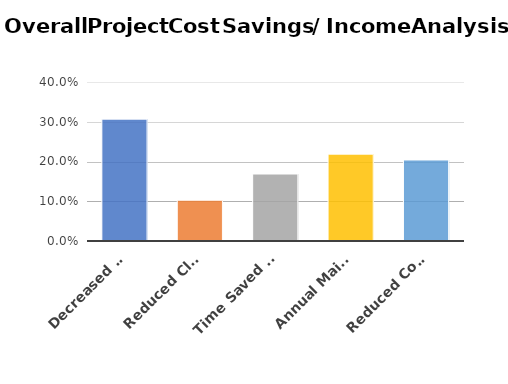
| Category | Series 0 |
|---|---|
| Decreased Helpdesk Support | 0.307 |
| Reduced Clerical Staff | 0.103 |
| Time Saved - manual creation of reports | 0.168 |
| Annual Maintenance | 0.219 |
| Reduced Consumables  | 0.204 |